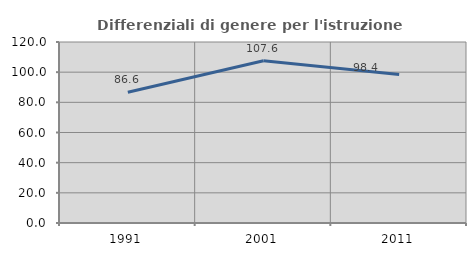
| Category | Differenziali di genere per l'istruzione superiore |
|---|---|
| 1991.0 | 86.629 |
| 2001.0 | 107.57 |
| 2011.0 | 98.379 |